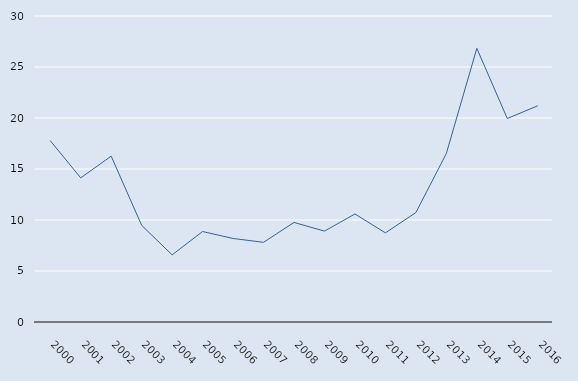
| Category | Series 0 |
|---|---|
| 2000.0 | 17.78 |
| 2001.0 | 14.13 |
| 2002.0 | 16.26 |
| 2003.0 | 9.48 |
| 2004.0 | 6.58 |
| 2005.0 | 8.87 |
| 2006.0 | 8.19 |
| 2007.0 | 7.81 |
| 2008.0 | 9.76 |
| 2009.0 | 8.91 |
| 2010.0 | 10.59 |
| 2011.0 | 8.739 |
| 2012.0 | 10.73 |
| 2013.0 | 16.52 |
| 2014.0 | 26.83 |
| 2015.0 | 19.95 |
| 2016.0 | 21.2 |